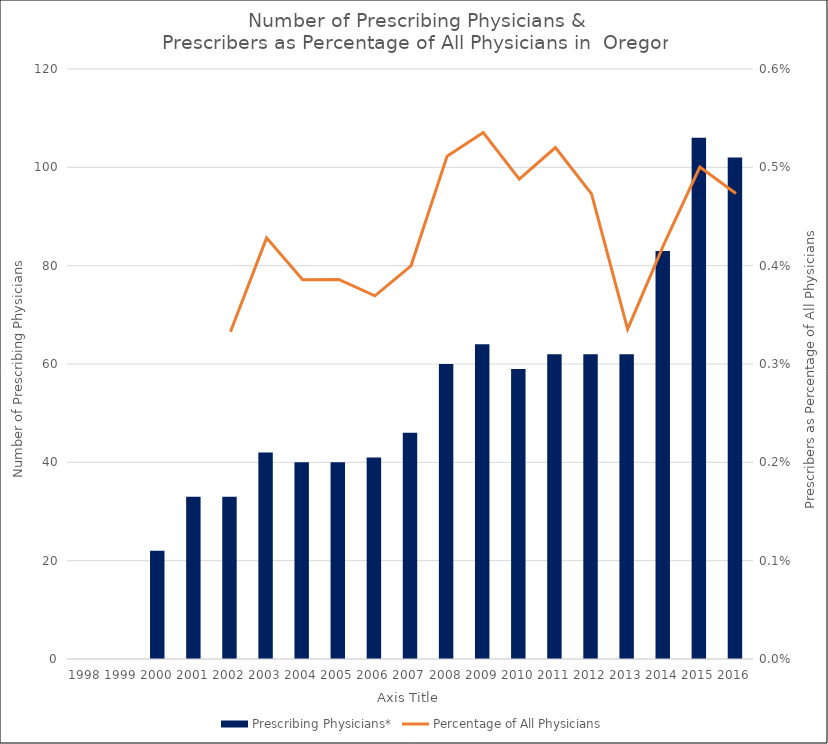
| Category | Prescribing Physicians* |
|---|---|
| 1998 | 0 |
| 1999 | 0 |
| 2000 | 22 |
| 2001 | 33 |
| 2002 | 33 |
| 2003 | 42 |
| 2004 | 40 |
| 2005 | 40 |
| 2006 | 41 |
| 2007 | 46 |
| 2008 | 60 |
| 2009 | 64 |
| 2010 | 59 |
| 2011 | 62 |
| 2012 | 62 |
| 2013 | 62 |
| 2014 | 83 |
| 2015 | 106 |
| 2016 | 102 |